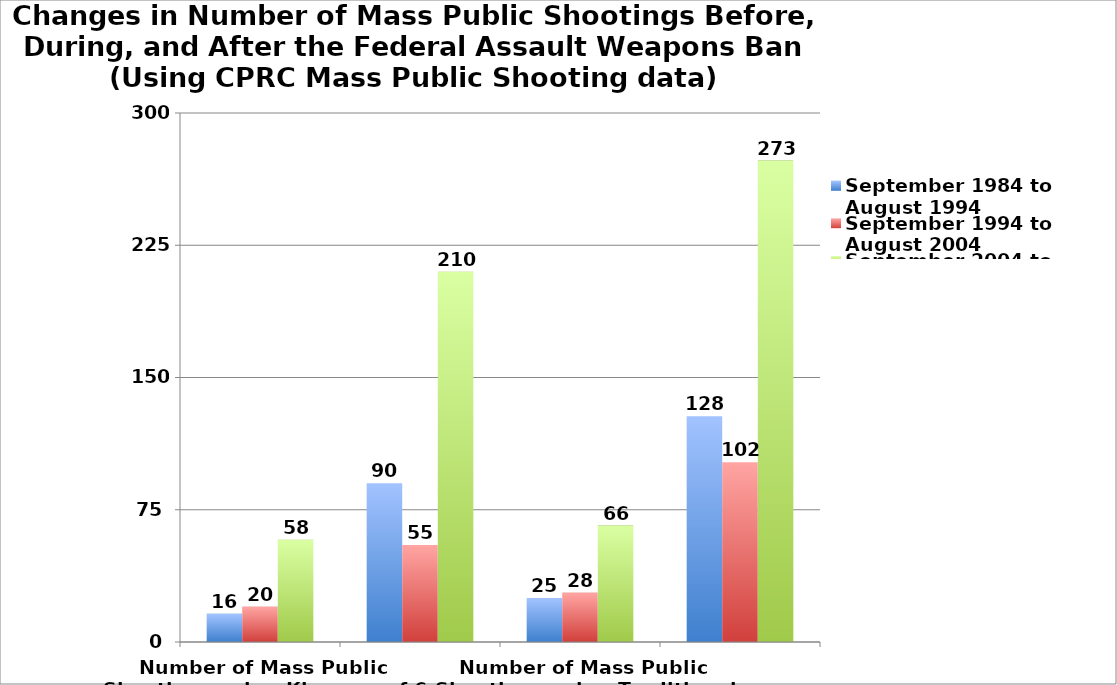
| Category | September 1984 to August 1994 | September 1994 to August 2004 | September 2004 to August 2014 |
|---|---|---|---|
| Number of Mass Public Shootings using Klaveras of 6 or more killed | 16 | 20 | 58 |
|  | 90 | 55 | 210 |
| Number of Mass Public Shootings using Traditional FBI Definition of 4 or more killed | 25 | 28 | 66 |
|  | 128 | 102 | 273 |